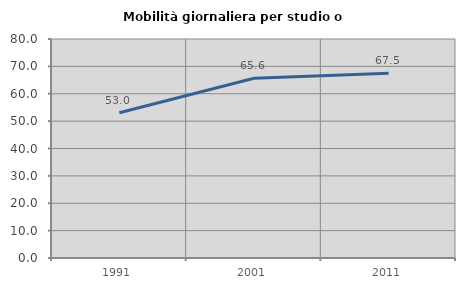
| Category | Mobilità giornaliera per studio o lavoro |
|---|---|
| 1991.0 | 53.043 |
| 2001.0 | 65.639 |
| 2011.0 | 67.518 |